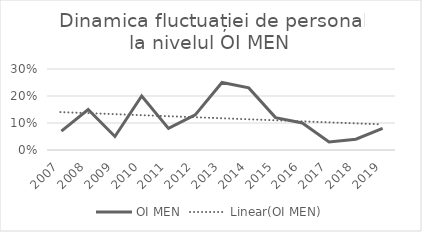
| Category | OI MEN |
|---|---|
| 2007.0 | 0.07 |
| 2008.0 | 0.15 |
| 2009.0 | 0.05 |
| 2010.0 | 0.2 |
| 2011.0 | 0.08 |
| 2012.0 | 0.13 |
| 2013.0 | 0.25 |
| 2014.0 | 0.23 |
| 2015.0 | 0.12 |
| 2016.0 | 0.1 |
| 2017.0 | 0.03 |
| 2018.0 | 0.04 |
| 2019.0 | 0.08 |